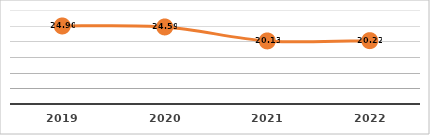
| Category | REPROBACIÓN (%)
PRIMER SEMESTRE, EJERCICIO 2022

 |
|---|---|
| 2019.0 | 24.9 |
| 2020.0 | 24.59 |
| 2021.0 | 20.13 |
| 2022.0 | 20.22 |